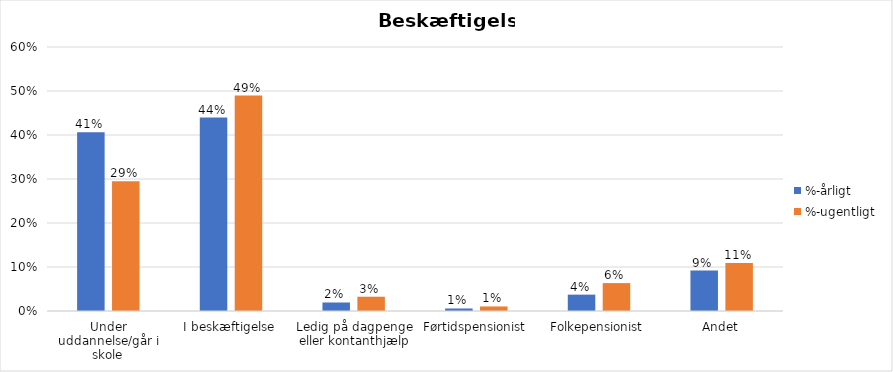
| Category | %-årligt | %-ugentligt |
|---|---|---|
| Under uddannelse/går i skole | 0.406 | 0.295 |
| I beskæftigelse | 0.44 | 0.49 |
| Ledig på dagpenge eller kontanthjælp | 0.019 | 0.032 |
| Førtidspensionist | 0.006 | 0.01 |
| Folkepensionist | 0.037 | 0.063 |
| Andet | 0.092 | 0.109 |